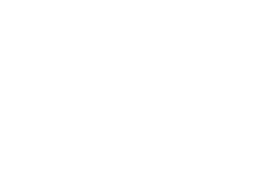
| Category | Series 0 |
|---|---|
| Leben | 0 |
| Wohnen | 0 |
| Investieren | 0 |
| Schutzengel | 0 |
| Ungeplant | 0 |